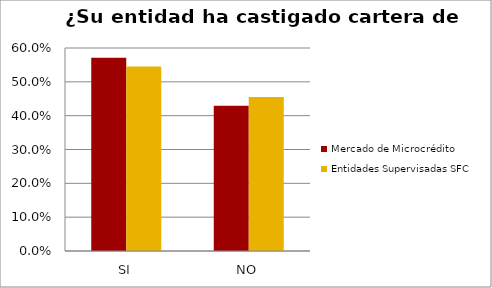
| Category | Mercado de Microcrédito | Entidades Supervisadas SFC |
|---|---|---|
| SI | 0.571 | 0.545 |
| NO | 0.429 | 0.455 |